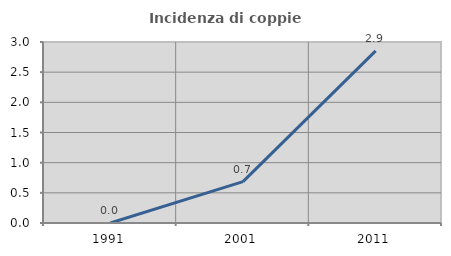
| Category | Incidenza di coppie miste |
|---|---|
| 1991.0 | 0 |
| 2001.0 | 0.685 |
| 2011.0 | 2.852 |